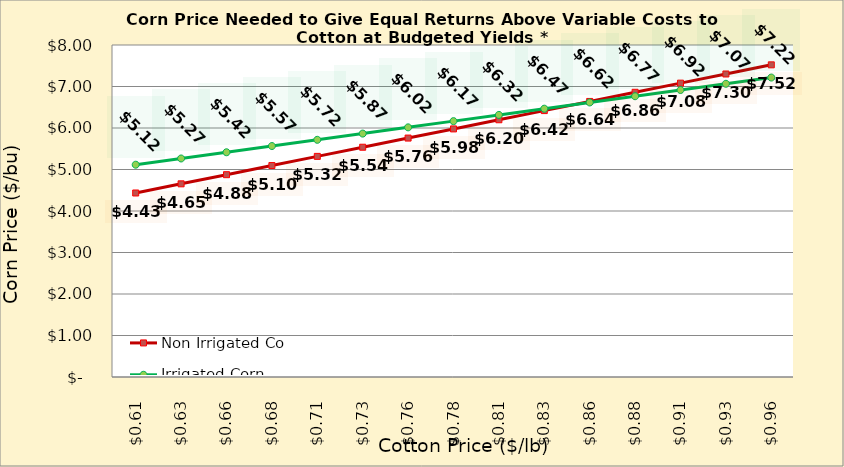
| Category | Non Irrigated Corn | Irrigated Corn |
|---|---|---|
| 0.6049999999999999 | 4.434 | 5.115 |
| 0.6299999999999999 | 4.654 | 5.265 |
| 0.6549999999999999 | 4.875 | 5.415 |
| 0.6799999999999999 | 5.096 | 5.565 |
| 0.705 | 5.316 | 5.715 |
| 0.73 | 5.537 | 5.865 |
| 0.755 | 5.757 | 6.015 |
| 0.78 | 5.978 | 6.165 |
| 0.805 | 6.199 | 6.315 |
| 0.8300000000000001 | 6.419 | 6.465 |
| 0.8550000000000001 | 6.64 | 6.615 |
| 0.8800000000000001 | 6.86 | 6.765 |
| 0.9050000000000001 | 7.081 | 6.915 |
| 0.9300000000000002 | 7.301 | 7.065 |
| 0.9550000000000002 | 7.522 | 7.215 |